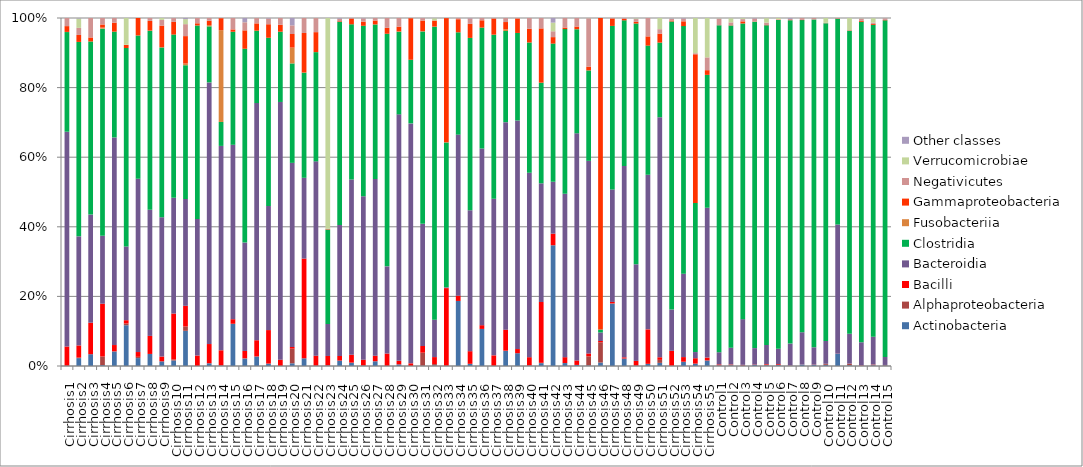
| Category | Actinobacteria | Alphaproteobacteria | Bacilli | Bacteroidia | Clostridia | Fusobacteriia | Gammaproteobacteria | Negativicutes | Verrucomicrobiae | Other classes |
|---|---|---|---|---|---|---|---|---|---|---|
| Cirrhosis1 | 0 | 0.001 | 0.055 | 0.614 | 0.285 | 0 | 0.017 | 0.023 | 0 | 0 |
| Cirrhosis2 | 0.022 | 0.001 | 0.035 | 0.31 | 0.552 | 0 | 0.02 | 0.02 | 0.027 | 0.001 |
| Cirrhosis3 | 0.034 | 0 | 0.09 | 0.307 | 0.492 | 0 | 0.011 | 0.055 | 0 | 0 |
| Cirrhosis4 | 0.003 | 0.025 | 0.151 | 0.195 | 0.594 | 0.003 | 0.009 | 0.019 | 0 | 0 |
| Cirrhosis5 | 0.041 | 0 | 0.018 | 0.592 | 0.302 | 0 | 0.026 | 0.013 | 0 | 0 |
| Cirrhosis6 | 0.116 | 0.005 | 0.009 | 0.21 | 0.566 | 0 | 0.009 | 0.001 | 0.076 | 0 |
| Cirrhosis7 | 0.023 | 0.004 | 0.014 | 0.497 | 0.41 | 0 | 0.05 | 0 | 0 | 0 |
| Cirrhosis8 | 0.034 | 0 | 0.052 | 0.361 | 0.513 | 0 | 0.028 | 0.008 | 0 | 0 |
| Cirrhosis9 | 0.013 | 0 | 0.014 | 0.399 | 0.487 | 0 | 0.062 | 0.017 | 0.005 | 0 |
| Cirrhosis10 | 0.016 | 0.003 | 0.131 | 0.329 | 0.464 | 0 | 0.036 | 0.011 | 0 | 0 |
| Cirrhosis11 | 0.097 | 0.012 | 0.057 | 0.294 | 0.368 | 0.005 | 0.075 | 0.033 | 0.014 | 0.003 |
| Cirrhosis12 | 0 | 0 | 0.03 | 0.391 | 0.555 | 0 | 0.006 | 0.015 | 0 | 0 |
| Cirrhosis13 | 0.008 | 0 | 0.055 | 0.748 | 0.16 | 0.004 | 0.013 | 0.008 | 0 | 0 |
| Cirrhosis14 | 0.001 | 0 | 0.044 | 0.585 | 0.069 | 0.263 | 0.034 | 0.001 | 0 | 0 |
| Cirrhosis15 | 0.118 | 0 | 0.013 | 0.49 | 0.318 | 0 | 0.007 | 0.032 | 0 | 0 |
| Cirrhosis16 | 0.021 | 0.001 | 0.021 | 0.307 | 0.548 | 0 | 0.052 | 0.023 | 0 | 0.012 |
| Cirrhosis17 | 0.027 | 0 | 0.046 | 0.679 | 0.207 | 0 | 0.021 | 0.015 | 0 | 0 |
| Cirrhosis18 | 0.007 | 0 | 0.096 | 0.355 | 0.481 | 0 | 0.039 | 0.016 | 0 | 0.002 |
| Cirrhosis19 | 0 | 0 | 0.018 | 0.737 | 0.201 | 0 | 0.02 | 0.019 | 0 | 0 |
| Cirrhosis20 | 0.008 | 0.042 | 0.005 | 0.523 | 0.282 | 0.045 | 0.038 | 0.025 | 0 | 0.021 |
| Cirrhosis21 | 0.022 | 0 | 0.284 | 0.23 | 0.299 | 0.001 | 0.113 | 0.043 | 0 | 0 |
| Cirrhosis22 | 0.001 | 0.001 | 0.028 | 0.555 | 0.312 | 0 | 0.057 | 0.04 | 0 | 0 |
| Cirrhosis23 | 0.002 | 0 | 0.027 | 0.091 | 0.268 | 0 | 0.001 | 0.001 | 0.597 | 0 |
| Cirrhosis24 | 0.015 | 0 | 0.013 | 0.375 | 0.581 | 0 | 0.002 | 0.007 | 0 | 0.002 |
| Cirrhosis25 | 0.01 | 0 | 0.022 | 0.5 | 0.443 | 0 | 0.016 | 0.001 | 0 | 0.001 |
| Cirrhosis26 | 0.002 | 0 | 0.016 | 0.465 | 0.486 | 0 | 0.012 | 0.009 | 0 | 0.001 |
| Cirrhosis27 | 0.013 | 0 | 0.016 | 0.506 | 0.442 | 0 | 0.011 | 0.007 | 0 | 0 |
| Cirrhosis28 | 0 | 0 | 0.035 | 0.247 | 0.66 | 0 | 0.017 | 0.028 | 0 | 0 |
| Cirrhosis29 | 0.005 | 0 | 0.01 | 0.704 | 0.236 | 0.001 | 0.014 | 0.025 | 0 | 0 |
| Cirrhosis30 | 0 | 0 | 0.007 | 0.688 | 0.182 | 0 | 0.119 | 0.001 | 0 | 0 |
| Cirrhosis31 | 0.001 | 0.037 | 0.019 | 0.348 | 0.548 | 0 | 0.031 | 0.007 | 0 | 0 |
| Cirrhosis32 | 0.002 | 0.004 | 0.02 | 0.106 | 0.832 | 0 | 0.017 | 0.001 | 0.006 | 0.001 |
| Cirrhosis33 | 0.001 | 0 | 0.222 | 0.002 | 0.414 | 0 | 0.355 | 0 | 0 | 0 |
| Cirrhosis34 | 0.186 | 0 | 0.015 | 0.461 | 0.293 | 0 | 0.037 | 0.003 | 0 | 0 |
| Cirrhosis35 | 0.006 | 0 | 0.036 | 0.403 | 0.493 | 0 | 0.04 | 0.016 | 0 | 0.001 |
| Cirrhosis36 | 0.106 | 0 | 0.011 | 0.506 | 0.347 | 0 | 0.021 | 0.007 | 0 | 0 |
| Cirrhosis37 | 0.001 | 0 | 0.03 | 0.447 | 0.468 | 0 | 0.046 | 0.002 | 0 | 0 |
| Cirrhosis38 | 0.043 | 0.001 | 0.06 | 0.594 | 0.261 | 0.005 | 0.021 | 0.012 | 0 | 0 |
| Cirrhosis39 | 0.037 | 0 | 0.012 | 0.653 | 0.25 | 0 | 0.041 | 0.001 | 0 | 0 |
| Cirrhosis40 | 0.001 | 0 | 0.023 | 0.523 | 0.369 | 0 | 0.039 | 0.03 | 0 | 0 |
| Cirrhosis41 | 0.008 | 0.001 | 0.173 | 0.338 | 0.287 | 0 | 0.155 | 0.03 | 0 | 0 |
| Cirrhosis42 | 0.338 | 0 | 0.032 | 0.145 | 0.387 | 0 | 0.018 | 0.016 | 0.024 | 0.013 |
| Cirrhosis43 | 0.008 | 0 | 0.017 | 0.468 | 0.472 | 0 | 0.005 | 0.027 | 0 | 0 |
| Cirrhosis44 | 0.003 | 0 | 0.013 | 0.651 | 0.298 | 0 | 0.008 | 0.024 | 0 | 0 |
| Cirrhosis45 | 0.002 | 0.026 | 0.008 | 0.548 | 0.257 | 0 | 0.011 | 0.138 | 0.001 | 0 |
| Cirrhosis46 | 0.01 | 0.056 | 0.004 | 0.024 | 0.008 | 0 | 0.867 | 0 | 0 | 0 |
| Cirrhosis47 | 0.177 | 0.001 | 0.004 | 0.32 | 0.466 | 0 | 0.021 | 0.001 | 0 | 0 |
| Cirrhosis48 | 0.021 | 0 | 0.003 | 0.548 | 0.417 | 0 | 0.004 | 0.003 | 0 | 0 |
| Cirrhosis49 | 0 | 0.001 | 0.013 | 0.272 | 0.677 | 0 | 0.005 | 0.008 | 0.002 | 0.001 |
| Cirrhosis50 | 0.006 | 0 | 0.099 | 0.441 | 0.369 | 0 | 0.026 | 0.052 | 0 | 0 |
| Cirrhosis51 | 0.009 | 0.009 | 0.007 | 0.687 | 0.214 | 0 | 0.026 | 0.013 | 0.032 | 0 |
| Cirrhosis52 | 0 | 0.001 | 0.042 | 0.118 | 0.823 | 0 | 0.003 | 0.005 | 0.001 | 0.001 |
| Cirrhosis53 | 0.012 | 0.001 | 0.013 | 0.235 | 0.698 | 0 | 0.014 | 0.008 | 0 | 0.001 |
| Cirrhosis54 | 0.007 | 0 | 0.015 | 0.018 | 0.425 | 0 | 0.424 | 0.003 | 0.1 | 0 |
| Cirrhosis55 | 0.016 | 0 | 0.008 | 0.427 | 0.379 | 0 | 0.013 | 0.037 | 0.112 | 0 |
| Control1 | 0.001 | 0.001 | 0.002 | 0.035 | 0.938 | 0 | 0 | 0.019 | 0.001 | 0.001 |
| Control2 | 0.002 | 0.002 | 0.001 | 0.047 | 0.92 | 0 | 0.001 | 0.008 | 0.012 | 0 |
| Control3 | 0.002 | 0 | 0.001 | 0.128 | 0.828 | 0 | 0.006 | 0.006 | 0.003 | 0 |
| Control4 | 0.003 | 0 | 0.001 | 0.048 | 0.957 | 0 | 0.001 | 0.008 | 0 | 0.001 |
| Control5 | 0.002 | 0.002 | 0.002 | 0.055 | 0.922 | 0 | 0.001 | 0.007 | 0.013 | 0 |
| Control6 | 0.003 | 0 | 0.003 | 0.046 | 0.968 | 0 | 0.001 | 0.001 | 0.004 | 0 |
| Control7 | 0.001 | 0 | 0.001 | 0.063 | 0.935 | 0 | 0 | 0.004 | 0 | 0.002 |
| Control8 | 0.004 | 0 | 0 | 0.094 | 0.906 | 0 | 0.001 | 0.006 | 0 | 0 |
| Control9 | 0.003 | 0 | 0.001 | 0.051 | 0.958 | 0 | 0 | 0.004 | 0 | 0 |
| Control10 | 0.003 | 0.003 | 0 | 0.064 | 0.894 | 0 | 0 | 0.001 | 0.014 | 0 |
| Control11 | 0.035 | 0 | 0 | 0.371 | 0.589 | 0 | 0.001 | 0.001 | 0 | 0 |
| Control12 | 0.002 | 0.004 | 0 | 0.085 | 0.861 | 0 | 0.001 | 0 | 0.034 | 0 |
| Control13 | 0 | 0 | 0.001 | 0.066 | 0.915 | 0 | 0.003 | 0.006 | 0.001 | 0.001 |
| Control14 | 0.002 | 0.002 | 0.001 | 0.079 | 0.883 | 0 | 0.003 | 0.004 | 0.013 | 0 |
| Control15 | 0.002 | 0.001 | 0 | 0.023 | 0.96 | 0 | 0.001 | 0.005 | 0 | 0.001 |